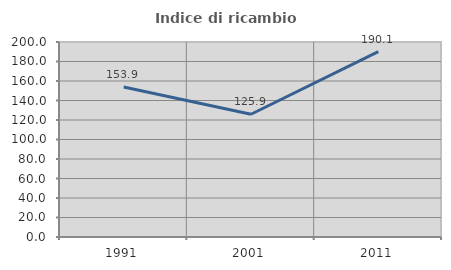
| Category | Indice di ricambio occupazionale  |
|---|---|
| 1991.0 | 153.901 |
| 2001.0 | 125.882 |
| 2011.0 | 190.141 |